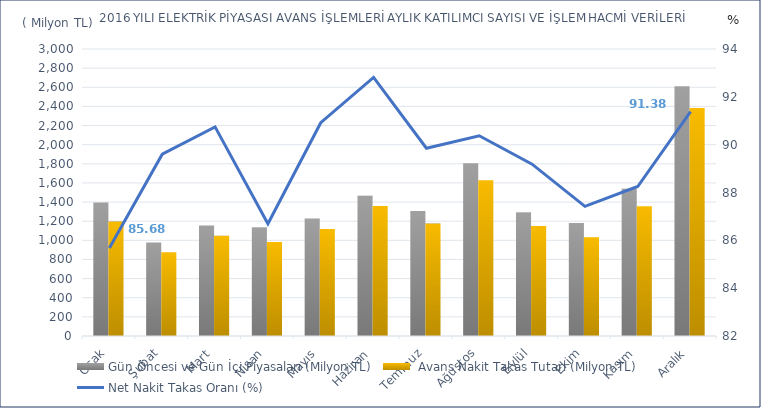
| Category | Gün Öncesi ve Gün İçi Piyasaları (Milyon TL) |  Avans Nakit Takas Tutarı (Milyon TL) |
|---|---|---|
| Ocak | 1395.936 | 1195.989 |
| Şubat | 978.165 | 876.44 |
| Mart | 1155.104 | 1048.183 |
| Nisan | 1132.893 | 982.121 |
| Mayıs | 1229.03 | 1117.41 |
| Haziran | 1464.832 | 1359.55 |
| Temmuz | 1307.794 | 1175.048 |
| Ağustos | 1801.899 | 1628.387 |
| Eylül | 1290.691 | 1151.107 |
| Ekim | 1181.14 | 1032.543 |
| Kasım | 1538.147 | 1357.423 |
| Aralık | 2607.788 | 2382.938 |